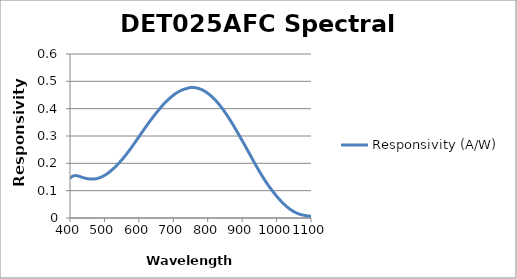
| Category | Responsivity (A/W) |
|---|---|
| 400.0 | 0.146 |
| 410.0 | 0.154 |
| 420.0 | 0.155 |
| 430.0 | 0.151 |
| 440.0 | 0.147 |
| 450.0 | 0.144 |
| 460.0 | 0.142 |
| 470.0 | 0.143 |
| 480.0 | 0.145 |
| 490.0 | 0.149 |
| 500.0 | 0.156 |
| 510.0 | 0.164 |
| 520.0 | 0.174 |
| 530.0 | 0.185 |
| 540.0 | 0.198 |
| 550.0 | 0.212 |
| 560.0 | 0.227 |
| 570.0 | 0.244 |
| 580.0 | 0.261 |
| 590.0 | 0.279 |
| 600.0 | 0.297 |
| 610.0 | 0.315 |
| 620.0 | 0.333 |
| 630.0 | 0.351 |
| 640.0 | 0.367 |
| 650.0 | 0.384 |
| 660.0 | 0.399 |
| 670.0 | 0.414 |
| 680.0 | 0.427 |
| 690.0 | 0.438 |
| 700.0 | 0.449 |
| 710.0 | 0.458 |
| 720.0 | 0.465 |
| 730.0 | 0.47 |
| 740.0 | 0.474 |
| 750.0 | 0.478 |
| 760.0 | 0.477 |
| 770.0 | 0.475 |
| 780.0 | 0.471 |
| 790.0 | 0.465 |
| 800.0 | 0.456 |
| 810.0 | 0.446 |
| 820.0 | 0.434 |
| 830.0 | 0.42 |
| 840.0 | 0.405 |
| 850.0 | 0.387 |
| 860.0 | 0.368 |
| 870.0 | 0.348 |
| 880.0 | 0.327 |
| 890.0 | 0.306 |
| 900.0 | 0.283 |
| 910.0 | 0.261 |
| 920.0 | 0.238 |
| 930.0 | 0.215 |
| 940.0 | 0.193 |
| 950.0 | 0.171 |
| 960.0 | 0.15 |
| 970.0 | 0.13 |
| 980.0 | 0.113 |
| 990.0 | 0.096 |
| 1000.0 | 0.08 |
| 1010.0 | 0.066 |
| 1020.0 | 0.053 |
| 1030.0 | 0.041 |
| 1040.0 | 0.031 |
| 1050.0 | 0.023 |
| 1060.0 | 0.017 |
| 1070.0 | 0.013 |
| 1080.0 | 0.01 |
| 1090.0 | 0.008 |
| 1100.0 | 0.006 |